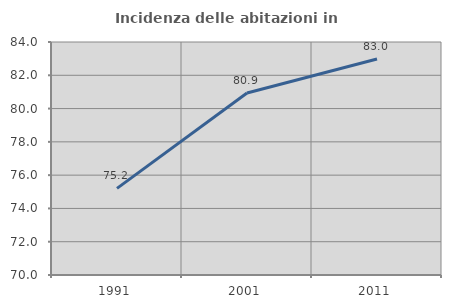
| Category | Incidenza delle abitazioni in proprietà  |
|---|---|
| 1991.0 | 75.206 |
| 2001.0 | 80.938 |
| 2011.0 | 82.98 |